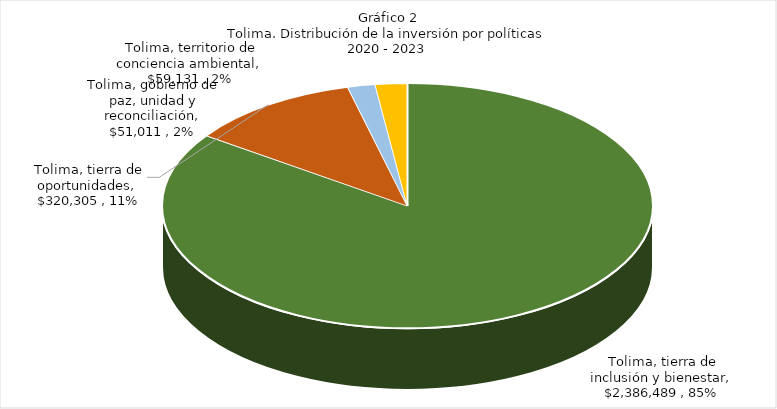
| Category | Series 0 | Series 1 |
|---|---|---|
| Tolima, tierra de inclusión y bienestar | 2386489.292 | 0.847 |
| Tolima, tierra de oportunidades | 320305.025 | 0.114 |
| Tolima, gobierno de paz, unidad y reconciliación | 51010.975 | 0.018 |
| Tolima, territorio de conciencia ambiental | 59131.023 | 0.021 |